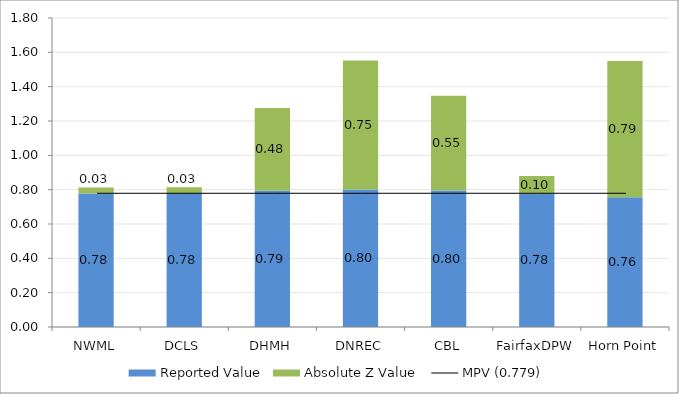
| Category | Reported Value | Absolute Z Value  |
|---|---|---|
| NWML | 0.778 | 0.034 |
| DCLS | 0.78 | 0.034 |
| DHMH | 0.793 | 0.483 |
| DNREC | 0.801 | 0.752 |
| CBL | 0.795 | 0.552 |
| FairfaxDPW | 0.776 | 0.103 |
| Horn Point | 0.756 | 0.793 |